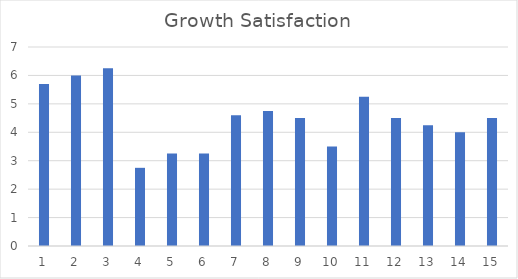
| Category | Growth Satisfaction |
|---|---|
| 0 | 5.7 |
| 1 | 6 |
| 2 | 6.25 |
| 3 | 2.75 |
| 4 | 3.25 |
| 5 | 3.25 |
| 6 | 4.6 |
| 7 | 4.75 |
| 8 | 4.5 |
| 9 | 3.5 |
| 10 | 5.25 |
| 11 | 4.5 |
| 12 | 4.25 |
| 13 | 4 |
| 14 | 4.5 |